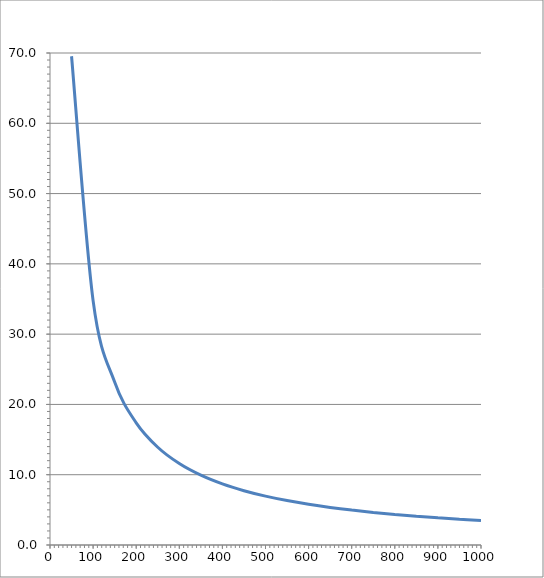
| Category | Series 0 |
|---|---|
| 1000.0 | 3.477 |
| 950.0 | 3.66 |
| 900.0 | 3.863 |
| 850.0 | 4.09 |
| 800.0 | 4.346 |
| 750.0 | 4.636 |
| 700.0 | 4.967 |
| 650.0 | 5.349 |
| 600.0 | 5.795 |
| 550.0 | 6.322 |
| 500.0 | 6.954 |
| 450.0 | 7.726 |
| 400.0 | 8.692 |
| 350.0 | 9.934 |
| 300.0 | 11.589 |
| 250.0 | 13.907 |
| 200.0 | 17.384 |
| 150.0 | 23.179 |
| 100.0 | 34.768 |
| 50.0 | 69.537 |